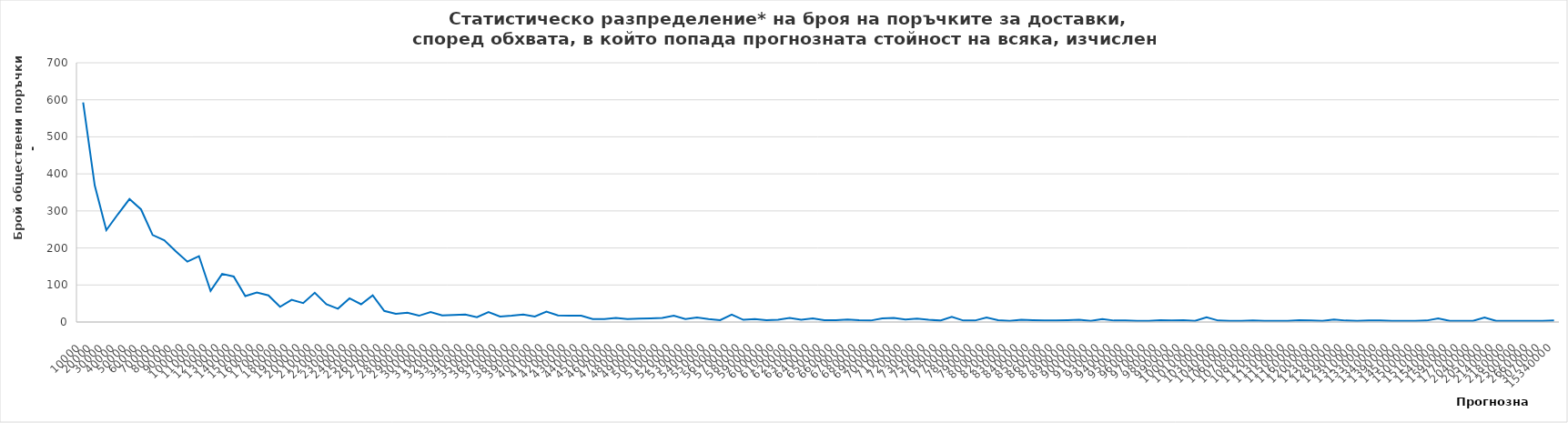
| Category | брой |
|---|---|
| 10000.0 | 593 |
| 20000.0 | 369 |
| 30000.0 | 248 |
| 40000.0 | 291 |
| 50000.0 | 332 |
| 60000.0 | 304 |
| 70000.0 | 235 |
| 80000.0 | 221 |
| 90000.0 | 191 |
| 100000.0 | 163 |
| 110000.0 | 178 |
| 120000.0 | 84 |
| 130000.0 | 130 |
| 140000.0 | 123 |
| 150000.0 | 70 |
| 160000.0 | 80 |
| 170000.0 | 72 |
| 180000.0 | 41 |
| 190000.0 | 60 |
| 200000.0 | 51 |
| 210000.0 | 79 |
| 220000.0 | 48 |
| 230000.0 | 36 |
| 240000.0 | 64 |
| 250000.0 | 48 |
| 260000.0 | 72 |
| 270000.0 | 30 |
| 280000.0 | 22 |
| 290000.0 | 25 |
| 300000.0 | 17 |
| 310000.0 | 27 |
| 320000.0 | 18 |
| 330000.0 | 19 |
| 340000.0 | 20 |
| 350000.0 | 13 |
| 360000.0 | 27 |
| 370000.0 | 15 |
| 380000.0 | 17 |
| 390000.0 | 20 |
| 400000.0 | 15 |
| 410000.0 | 28 |
| 420000.0 | 18 |
| 430000.0 | 17 |
| 440000.0 | 17 |
| 450000.0 | 8 |
| 460000.0 | 8 |
| 470000.0 | 11 |
| 480000.0 | 8 |
| 490000.0 | 9 |
| 500000.0 | 10 |
| 510000.0 | 11 |
| 520000.0 | 17 |
| 530000.0 | 8 |
| 540000.0 | 12 |
| 550000.0 | 8 |
| 560000.0 | 5 |
| 570000.0 | 20 |
| 580000.0 | 6 |
| 590000.0 | 8 |
| 600000.0 | 5 |
| 610000.0 | 6 |
| 620000.0 | 11 |
| 630000.0 | 6 |
| 640000.0 | 10 |
| 650000.0 | 5 |
| 660000.0 | 5 |
| 670000.0 | 7 |
| 680000.0 | 5 |
| 690000.0 | 4 |
| 700000.0 | 10 |
| 710000.0 | 11 |
| 720000.0 | 7 |
| 730000.0 | 9 |
| 750000.0 | 6 |
| 760000.0 | 4 |
| 770000.0 | 14 |
| 780000.0 | 4 |
| 790000.0 | 4 |
| 800000.0 | 12 |
| 820000.0 | 5 |
| 830000.0 | 3 |
| 840000.0 | 6 |
| 850000.0 | 5 |
| 860000.0 | 4 |
| 870000.0 | 4 |
| 890000.0 | 5 |
| 900000.0 | 6 |
| 910000.0 | 3 |
| 930000.0 | 8 |
| 940000.0 | 4 |
| 950000.0 | 4 |
| 960000.0 | 3 |
| 970000.0 | 3 |
| 980000.0 | 5 |
| 990000.0 | 4 |
| 1000000.0 | 5 |
| 1010000.0 | 3 |
| 1030000.0 | 13 |
| 1040000.0 | 4 |
| 1060000.0 | 3 |
| 1070000.0 | 3 |
| 1080000.0 | 4 |
| 1120000.0 | 3 |
| 1130000.0 | 3 |
| 1150000.0 | 3 |
| 1160000.0 | 5 |
| 1200000.0 | 4 |
| 1230000.0 | 3 |
| 1280000.0 | 7 |
| 1290000.0 | 4 |
| 1310000.0 | 3 |
| 1330000.0 | 4 |
| 1340000.0 | 4 |
| 1390000.0 | 3 |
| 1450000.0 | 3 |
| 1500000.0 | 3 |
| 1510000.0 | 4 |
| 1540000.0 | 10 |
| 1590000.0 | 3 |
| 1770000.0 | 3 |
| 2040000.0 | 3 |
| 2050000.0 | 12 |
| 2140000.0 | 3 |
| 2180000.0 | 3 |
| 2500000.0 | 3 |
| 2660000.0 | 3 |
| 3070000.0 | 3 |
| 15340000.0 | 4 |